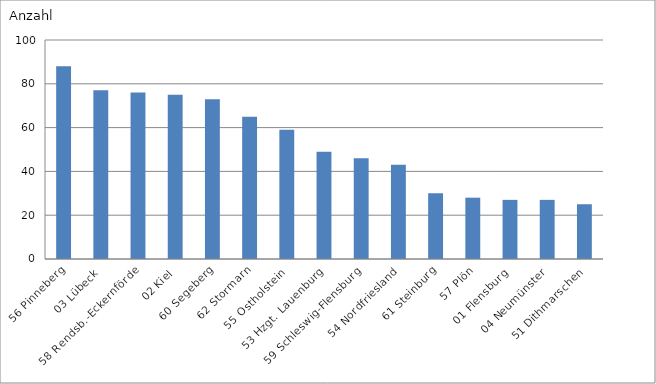
| Category | 56 Pinneberg |
|---|---|
| 56 Pinneberg | 88 |
| 03 Lübeck | 77 |
| 58 Rendsb.-Eckernförde | 76 |
| 02 Kiel | 75 |
| 60 Segeberg | 73 |
| 62 Stormarn | 65 |
| 55 Ostholstein | 59 |
| 53 Hzgt. Lauenburg | 49 |
| 59 Schleswig-Flensburg | 46 |
| 54 Nordfriesland | 43 |
| 61 Steinburg | 30 |
| 57 Plön | 28 |
| 01 Flensburg | 27 |
| 04 Neumünster | 27 |
| 51 Dithmarschen | 25 |